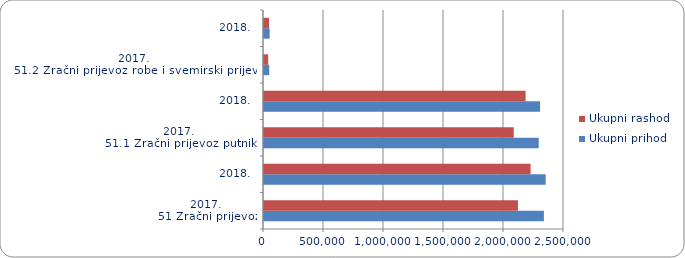
| Category | Ukupni prihod | Ukupni rashod |
|---|---|---|
| 0 | 2332601.472 | 2116190.253 |
| 1 | 2347400.217 | 2221769.692 |
| 2 | 2289396.768 | 2081154.357 |
| 3 | 2300391.804 | 2180101.48 |
| 4 | 43204.704 | 35035.896 |
| 5 | 47008.413 | 41668.212 |